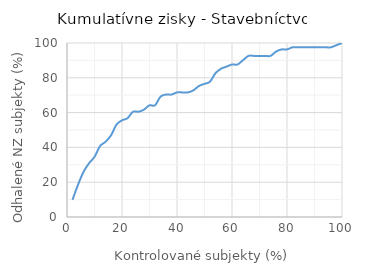
| Category | Stavebníctvo |
|---|---|
| 2.0 | 9.877 |
| 4.0 | 18.519 |
| 6.0 | 25.926 |
| 8.0 | 30.864 |
| 10.0 | 34.568 |
| 12.0 | 40.741 |
| 14.0 | 43.21 |
| 16.0 | 46.914 |
| 18.0 | 53.086 |
| 20.0 | 55.556 |
| 22.0 | 56.79 |
| 24.0 | 60.494 |
| 26.0 | 60.494 |
| 28.0 | 61.728 |
| 30.0 | 64.198 |
| 32.0 | 64.198 |
| 34.0 | 69.136 |
| 36.0 | 70.37 |
| 38.0 | 70.37 |
| 40.0 | 71.605 |
| 42.0 | 71.605 |
| 44.0 | 71.605 |
| 46.0 | 72.84 |
| 48.0 | 75.309 |
| 50.0 | 76.543 |
| 52.0 | 77.778 |
| 54.0 | 82.716 |
| 56.0 | 85.185 |
| 58.0 | 86.42 |
| 60.0 | 87.654 |
| 62.0 | 87.654 |
| 64.0 | 90.123 |
| 66.0 | 92.593 |
| 68.0 | 92.593 |
| 70.0 | 92.593 |
| 72.0 | 92.593 |
| 74.0 | 92.593 |
| 76.0 | 95.062 |
| 78.0 | 96.296 |
| 80.0 | 96.296 |
| 82.0 | 97.531 |
| 84.0 | 97.531 |
| 86.0 | 97.531 |
| 88.0 | 97.531 |
| 90.0 | 97.531 |
| 92.0 | 97.531 |
| 94.0 | 97.531 |
| 96.0 | 97.531 |
| 98.0 | 98.765 |
| 100.0 | 100 |